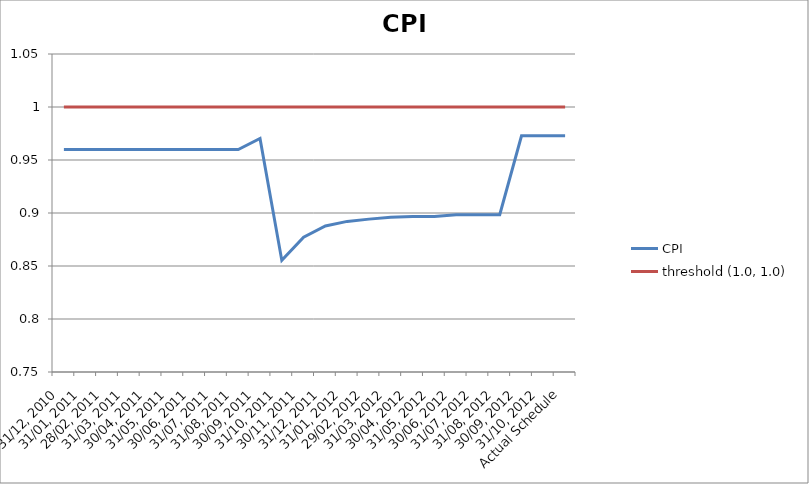
| Category | CPI | threshold (1.0, 1.0) |
|---|---|---|
| 31/12, 2010 | 0.96 | 1 |
| 31/01, 2011 | 0.96 | 1 |
| 28/02, 2011 | 0.96 | 1 |
| 31/03, 2011 | 0.96 | 1 |
| 30/04, 2011 | 0.96 | 1 |
| 31/05, 2011 | 0.96 | 1 |
| 30/06, 2011 | 0.96 | 1 |
| 31/07, 2011 | 0.96 | 1 |
| 31/08, 2011 | 0.96 | 1 |
| 30/09, 2011 | 0.97 | 1 |
| 31/10, 2011 | 0.855 | 1 |
| 30/11, 2011 | 0.877 | 1 |
| 31/12, 2011 | 0.888 | 1 |
| 31/01, 2012 | 0.892 | 1 |
| 29/02, 2012 | 0.894 | 1 |
| 31/03, 2012 | 0.896 | 1 |
| 30/04, 2012 | 0.897 | 1 |
| 31/05, 2012 | 0.897 | 1 |
| 30/06, 2012 | 0.898 | 1 |
| 31/07, 2012 | 0.898 | 1 |
| 31/08, 2012 | 0.898 | 1 |
| 30/09, 2012 | 0.973 | 1 |
| 31/10, 2012 | 0.973 | 1 |
| Actual Schedule | 0.973 | 1 |